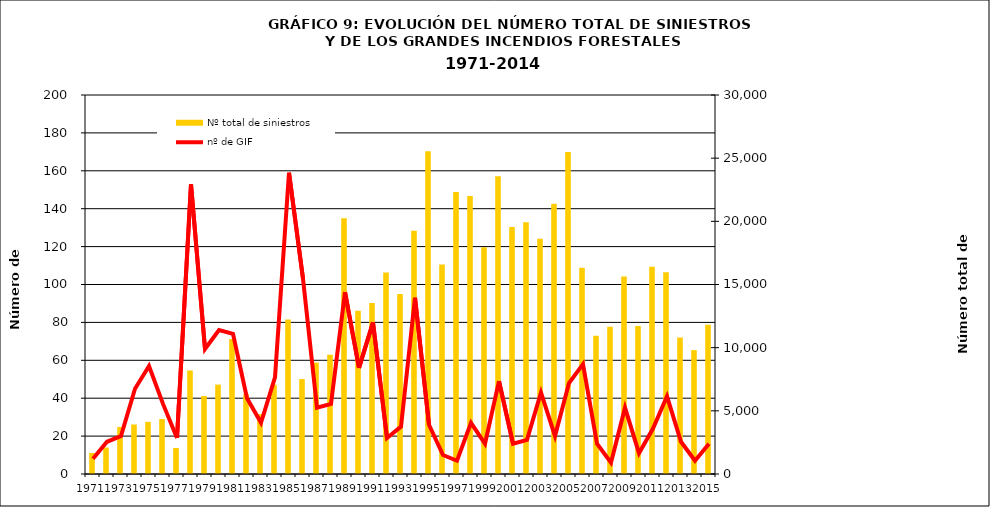
| Category | Nº total de siniestros |
|---|---|
| 1971.0 | 1665 |
| 1972.0 | 2093 |
| 1973.0 | 3724 |
| 1974.0 | 3920 |
| 1975.0 | 4128 |
| 1976.0 | 4356 |
| 1977.0 | 2064 |
| 1978.0 | 8193 |
| 1979.0 | 6171 |
| 1980.0 | 7075 |
| 1981.0 | 10688 |
| 1982.0 | 6308 |
| 1983.0 | 4736 |
| 1984.0 | 7073 |
| 1985.0 | 12235 |
| 1986.0 | 7514 |
| 1987.0 | 8816 |
| 1988.0 | 9440 |
| 1989.0 | 20250 |
| 1990.0 | 12914 |
| 1991.0 | 13529 |
| 1992.0 | 15956 |
| 1993.0 | 14253 |
| 1994.0 | 19249 |
| 1995.0 | 25557 |
| 1996.0 | 16586 |
| 1997.0 | 22320 |
| 1998.0 | 22003 |
| 1999.0 | 17943 |
| 2000.0 | 23574 |
| 2001.0 | 19547 |
| 2002.0 | 19929 |
| 2003.0 | 18616 |
| 2004.0 | 21396 |
| 2005.0 | 25492 |
| 2006.0 | 16334 |
| 2007.0 | 10936 |
| 2008.0 | 11655 |
| 2009.0 | 15643 |
| 2010.0 | 11722 |
| 2011.0 | 16414 |
| 2012.0 | 15978 |
| 2013.0 | 10797 |
| 2014.0 | 9806 |
| 2015.0 | 11810 |